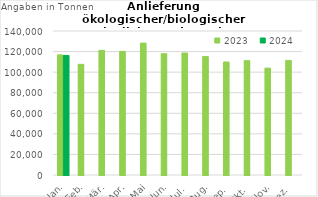
| Category | 2023 | 2024 |
|---|---|---|
| Jan. | 116779.33 | 116227.873 |
| Feb. | 107594.545 | 0 |
| Mär. | 121212.435 | 0 |
| Apr. | 120208.989 | 0 |
| Mai | 128253.711 | 0 |
| Jun. | 117942.851 | 0 |
| Jul. | 118612.122 | 0 |
| Aug. | 115248.086 | 0 |
| Sep. | 109871.811 | 0 |
| Okt. | 111178.903 | 0 |
| Nov. | 103910.089 | 0 |
| Dez. | 111419.496 | 0 |